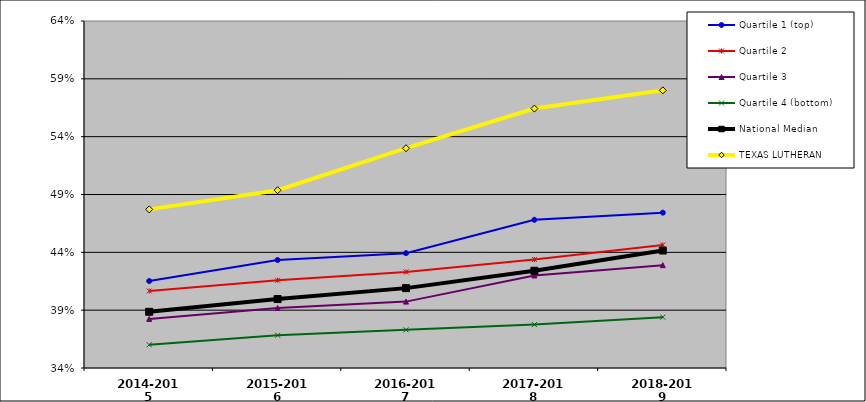
| Category | Quartile 1 (top) | Quartile 2 | Quartile 3 | Quartile 4 (bottom) | National Median | TEXAS LUTHERAN |
|---|---|---|---|---|---|---|
| 2014-2015 | 0.415 | 0.407 | 0.382 | 0.36 | 0.389 | 0.477 |
| 2015-2016 | 0.433 | 0.416 | 0.392 | 0.368 | 0.4 | 0.494 |
| 2016-2017 | 0.439 | 0.423 | 0.397 | 0.373 | 0.409 | 0.53 |
| 2017-2018 | 0.468 | 0.434 | 0.42 | 0.378 | 0.424 | 0.564 |
| 2018-2019 | 0.474 | 0.446 | 0.429 | 0.384 | 0.442 | 0.58 |